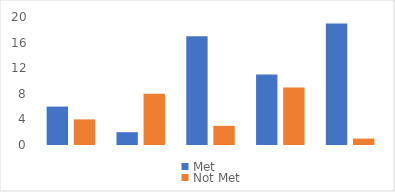
| Category | Met | Not Met |
|---|---|---|
| East | 6 | 4 |
| West | 2 | 8 |
| South | 17 | 3 |
| North | 11 | 9 |
| Central | 19 | 1 |